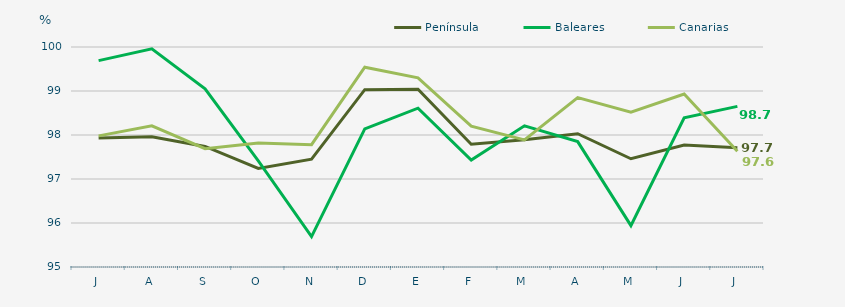
| Category | Península | Baleares | Canarias |
|---|---|---|---|
| J | 97.93 | 99.69 | 97.98 |
| A | 97.96 | 99.96 | 98.21 |
| S | 97.74 | 99.05 | 97.69 |
| O | 97.24 | 97.41 | 97.82 |
| N | 97.45 | 95.69 | 97.78 |
| D | 99.03 | 98.14 | 99.54 |
| E | 99.04 | 98.61 | 99.3 |
| F | 97.79 | 97.43 | 98.2 |
| M | 97.89 | 98.21 | 97.89 |
| A | 98.03 | 97.85 | 98.85 |
| M | 97.46 | 95.94 | 98.52 |
| J | 97.77 | 98.39 | 98.93 |
| J | 97.71 | 98.65 | 97.63 |